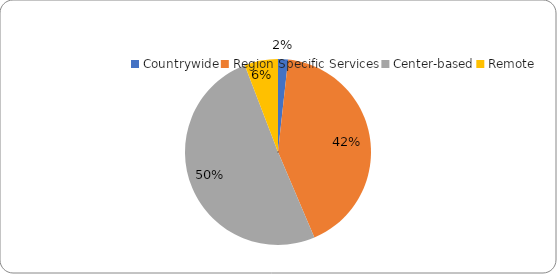
| Category | Series 0 |
|---|---|
| Countrywide | 3 |
| Region Specific Services | 72 |
| Center-based | 87 |
| Remote | 10 |